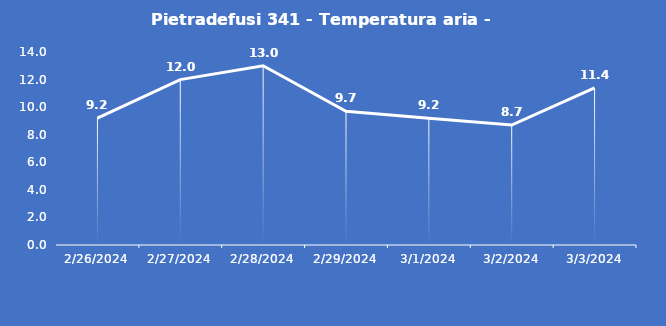
| Category | Pietradefusi 341 - Temperatura aria - Grezzo (°C) |
|---|---|
| 2/26/24 | 9.2 |
| 2/27/24 | 12 |
| 2/28/24 | 13 |
| 2/29/24 | 9.7 |
| 3/1/24 | 9.2 |
| 3/2/24 | 8.7 |
| 3/3/24 | 11.4 |